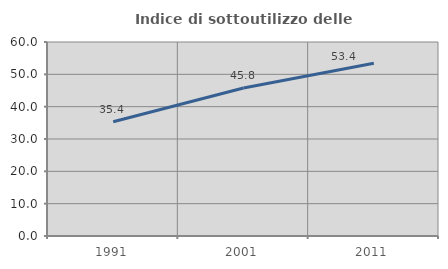
| Category | Indice di sottoutilizzo delle abitazioni  |
|---|---|
| 1991.0 | 35.35 |
| 2001.0 | 45.763 |
| 2011.0 | 53.401 |